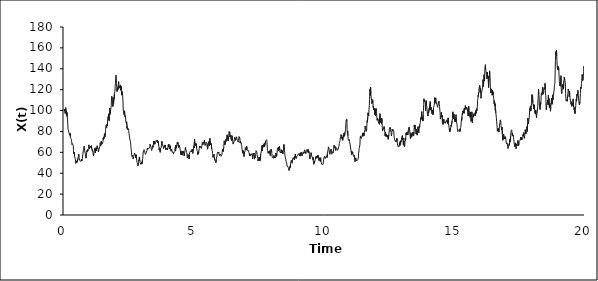
| Category | Series 0 |
|---|---|
| 0.0 | 100 |
| 0.01 | 101.451 |
| 0.02 | 100.935 |
| 0.03 | 99.133 |
| 0.04 | 97.322 |
| 0.05 | 99.582 |
| 0.06 | 102.812 |
| 0.07 | 97.484 |
| 0.08 | 99.941 |
| 0.09 | 95.324 |
| 0.1 | 94.769 |
| 0.11 | 98.044 |
| 0.12 | 93.605 |
| 0.13 | 91.877 |
| 0.14 | 86.959 |
| 0.15 | 82.516 |
| 0.16 | 81.269 |
| 0.17 | 81.424 |
| 0.18 | 79.445 |
| 0.19 | 78.421 |
| 0.2 | 78.264 |
| 0.21 | 78.665 |
| 0.22 | 76.45 |
| 0.23 | 78.109 |
| 0.24 | 74.912 |
| 0.25 | 74.454 |
| 0.26 | 73.343 |
| 0.27 | 72.908 |
| 0.28 | 72.195 |
| 0.29 | 70.321 |
| 0.3 | 67.404 |
| 0.31 | 66.803 |
| 0.32 | 68.365 |
| 0.33 | 68.56 |
| 0.34 | 67.762 |
| 0.35 | 66.431 |
| 0.36 | 61.621 |
| 0.37 | 58.789 |
| 0.38 | 57.875 |
| 0.39 | 60.299 |
| 0.4 | 56.46 |
| 0.41 | 57.028 |
| 0.42 | 56.393 |
| 0.43 | 53.548 |
| 0.44 | 53.317 |
| 0.45 | 49.472 |
| 0.46 | 48.525 |
| 0.47 | 48.72 |
| 0.48 | 49.797 |
| 0.49 | 51.939 |
| 0.5 | 50.464 |
| 0.51 | 50.947 |
| 0.52 | 50.012 |
| 0.53 | 50.361 |
| 0.54 | 54.984 |
| 0.55 | 56.422 |
| 0.56 | 58.247 |
| 0.57 | 56.465 |
| 0.58 | 53.922 |
| 0.59 | 53.454 |
| 0.6 | 52.035 |
| 0.61 | 52.263 |
| 0.62 | 52.199 |
| 0.63 | 51.727 |
| 0.64 | 51.348 |
| 0.65 | 50.667 |
| 0.66 | 51.636 |
| 0.67 | 53.599 |
| 0.68 | 51.683 |
| 0.69 | 53.148 |
| 0.7 | 54.255 |
| 0.71 | 56.475 |
| 0.72 | 58.19 |
| 0.73 | 59.071 |
| 0.74 | 62.389 |
| 0.75 | 62.453 |
| 0.76 | 64.327 |
| 0.77 | 65.738 |
| 0.78 | 63.385 |
| 0.79 | 62.608 |
| 0.8 | 60.332 |
| 0.81 | 59.084 |
| 0.82 | 57.493 |
| 0.83 | 55.543 |
| 0.84 | 54.444 |
| 0.85 | 56.63 |
| 0.86 | 57.421 |
| 0.87 | 57.441 |
| 0.88 | 61.735 |
| 0.89 | 60.618 |
| 0.9 | 62.57 |
| 0.91 | 61.144 |
| 0.92 | 61.824 |
| 0.93 | 62.497 |
| 0.94 | 63.682 |
| 0.95 | 67.142 |
| 0.96 | 65.563 |
| 0.97 | 63.39 |
| 0.98 | 63.021 |
| 0.99 | 62.961 |
| 1.0 | 64.101 |
| 1.01 | 65.732 |
| 1.02 | 64.725 |
| 1.03 | 63.854 |
| 1.04 | 64.057 |
| 1.05 | 66.403 |
| 1.06 | 63.3 |
| 1.07 | 62.745 |
| 1.08 | 61.685 |
| 1.09 | 62.677 |
| 1.1 | 60.776 |
| 1.11 | 60.891 |
| 1.12 | 57.862 |
| 1.13 | 56.495 |
| 1.14 | 58.837 |
| 1.15 | 60.035 |
| 1.16 | 61.666 |
| 1.17 | 62.194 |
| 1.18 | 63.827 |
| 1.19 | 62.336 |
| 1.2 | 59.356 |
| 1.21 | 62.633 |
| 1.22 | 64.475 |
| 1.23 | 62.412 |
| 1.24 | 61.426 |
| 1.25 | 64.162 |
| 1.26 | 65.332 |
| 1.27 | 66.295 |
| 1.28 | 66.498 |
| 1.29 | 66.126 |
| 1.3 | 63.152 |
| 1.31 | 62.245 |
| 1.32 | 60.383 |
| 1.33 | 62.31 |
| 1.34 | 62.064 |
| 1.35 | 62.882 |
| 1.36 | 63.177 |
| 1.37 | 65.195 |
| 1.38 | 67.477 |
| 1.39 | 69.127 |
| 1.4 | 66.031 |
| 1.41 | 68.474 |
| 1.42 | 67.36 |
| 1.43 | 70.635 |
| 1.44 | 68.477 |
| 1.45 | 67.583 |
| 1.46 | 68.59 |
| 1.47 | 68.131 |
| 1.48 | 68.42 |
| 1.49 | 70.366 |
| 1.5 | 73.67 |
| 1.51 | 72.034 |
| 1.52 | 74.569 |
| 1.53 | 73.319 |
| 1.54 | 75.301 |
| 1.55 | 77.765 |
| 1.56 | 77.622 |
| 1.57 | 74.952 |
| 1.58 | 78.365 |
| 1.59 | 80.963 |
| 1.6 | 83.975 |
| 1.61 | 84.336 |
| 1.62 | 86.025 |
| 1.63 | 83.426 |
| 1.64 | 86.504 |
| 1.65 | 85.995 |
| 1.66 | 85.355 |
| 1.67 | 89.982 |
| 1.68 | 89.493 |
| 1.69 | 94.159 |
| 1.7 | 91.401 |
| 1.71 | 96.834 |
| 1.72 | 93.762 |
| 1.73 | 90.224 |
| 1.74 | 94.099 |
| 1.75 | 102.38 |
| 1.76 | 102.456 |
| 1.77 | 96.445 |
| 1.78 | 99.122 |
| 1.79 | 100.974 |
| 1.8 | 103.315 |
| 1.81 | 105.257 |
| 1.82 | 111.909 |
| 1.83 | 113.558 |
| 1.84 | 113.208 |
| 1.85 | 111.108 |
| 1.86 | 108.02 |
| 1.87 | 103.811 |
| 1.88 | 107.613 |
| 1.89 | 109.384 |
| 1.9 | 106.893 |
| 1.91 | 112.179 |
| 1.92 | 110.914 |
| 1.93 | 116.15 |
| 1.94 | 115.364 |
| 1.95 | 118.043 |
| 1.96 | 123.143 |
| 1.97 | 126.343 |
| 1.98 | 127.058 |
| 1.99 | 133.756 |
| 2.0 | 132.527 |
| 2.01 | 126.044 |
| 2.02 | 121.928 |
| 2.03 | 118.244 |
| 2.04 | 118.373 |
| 2.05 | 121.777 |
| 2.06 | 119.601 |
| 2.07 | 119.529 |
| 2.08 | 124.057 |
| 2.09 | 127.627 |
| 2.1 | 126.548 |
| 2.11 | 121.366 |
| 2.12 | 123.246 |
| 2.13 | 122.931 |
| 2.14 | 121.85 |
| 2.15 | 121.499 |
| 2.16 | 124.575 |
| 2.17 | 119.477 |
| 2.18 | 119.425 |
| 2.19 | 123.182 |
| 2.2 | 119.778 |
| 2.21 | 114.72 |
| 2.22 | 118.328 |
| 2.23 | 119.092 |
| 2.24 | 115.721 |
| 2.25 | 114.009 |
| 2.26 | 108.883 |
| 2.27 | 100.636 |
| 2.28 | 100.022 |
| 2.29 | 97.554 |
| 2.3 | 96.179 |
| 2.31 | 98.093 |
| 2.32 | 99.727 |
| 2.33 | 95.149 |
| 2.34 | 93.896 |
| 2.35 | 95.221 |
| 2.36 | 94.059 |
| 2.37 | 89.782 |
| 2.38 | 88.179 |
| 2.39 | 87.855 |
| 2.4 | 89.28 |
| 2.41 | 90.222 |
| 2.42 | 82.907 |
| 2.43 | 84.418 |
| 2.44 | 83.854 |
| 2.45 | 81.54 |
| 2.46 | 82.562 |
| 2.47 | 81.995 |
| 2.48 | 81.108 |
| 2.49 | 78.311 |
| 2.5 | 76.604 |
| 2.51 | 74.66 |
| 2.52 | 74.73 |
| 2.53 | 71.79 |
| 2.54 | 70.991 |
| 2.55 | 70.102 |
| 2.56 | 66.619 |
| 2.57 | 63.626 |
| 2.58 | 62.191 |
| 2.59 | 58.351 |
| 2.6 | 56.142 |
| 2.61 | 55.658 |
| 2.62 | 56.773 |
| 2.63 | 57.236 |
| 2.64 | 55.425 |
| 2.65 | 53.703 |
| 2.66 | 53.854 |
| 2.67 | 56.014 |
| 2.68 | 56.968 |
| 2.69 | 57.441 |
| 2.7 | 59.389 |
| 2.71 | 59.734 |
| 2.72 | 58.289 |
| 2.73 | 57.903 |
| 2.74 | 56.89 |
| 2.75 | 54.564 |
| 2.76 | 57.76 |
| 2.77 | 55.769 |
| 2.78 | 56.254 |
| 2.79 | 51.869 |
| 2.8 | 50.507 |
| 2.81 | 50.355 |
| 2.82 | 48.319 |
| 2.83 | 46.989 |
| 2.84 | 47.598 |
| 2.85 | 48.814 |
| 2.86 | 50.127 |
| 2.87 | 52.764 |
| 2.88 | 51.748 |
| 2.89 | 55.562 |
| 2.9 | 54.276 |
| 2.91 | 53.59 |
| 2.92 | 49.791 |
| 2.93 | 49.325 |
| 2.94 | 49.516 |
| 2.95 | 48.377 |
| 2.96 | 49.18 |
| 2.97 | 48.83 |
| 2.98 | 50.702 |
| 2.99 | 49.147 |
| 3.0 | 49.968 |
| 3.01 | 53.089 |
| 3.02 | 54.234 |
| 3.03 | 58.381 |
| 3.04 | 58.597 |
| 3.05 | 61.628 |
| 3.06 | 62.386 |
| 3.07 | 62.598 |
| 3.08 | 61.817 |
| 3.09 | 61.621 |
| 3.1 | 61.221 |
| 3.11 | 60.943 |
| 3.12 | 58.039 |
| 3.13 | 57.825 |
| 3.14 | 57.858 |
| 3.15 | 57.528 |
| 3.16 | 59.799 |
| 3.17 | 60.305 |
| 3.18 | 61.927 |
| 3.19 | 61.994 |
| 3.2 | 64.098 |
| 3.21 | 62.814 |
| 3.22 | 63.068 |
| 3.23 | 62.582 |
| 3.24 | 63.942 |
| 3.25 | 63.853 |
| 3.26 | 64.202 |
| 3.27 | 63.746 |
| 3.28 | 64.237 |
| 3.29 | 65.532 |
| 3.3 | 67.724 |
| 3.31 | 68.231 |
| 3.32 | 66.95 |
| 3.33 | 65.668 |
| 3.34 | 65.569 |
| 3.35 | 62.905 |
| 3.36 | 61.761 |
| 3.37 | 62.226 |
| 3.38 | 62.884 |
| 3.39 | 64.867 |
| 3.4 | 66.386 |
| 3.41 | 64.768 |
| 3.42 | 65.919 |
| 3.43 | 68.011 |
| 3.44 | 70.444 |
| 3.45 | 67.608 |
| 3.46 | 70.818 |
| 3.47 | 69.681 |
| 3.48 | 69.127 |
| 3.49 | 67.831 |
| 3.5 | 68.104 |
| 3.51 | 69.182 |
| 3.52 | 68.684 |
| 3.53 | 68.956 |
| 3.54 | 71.369 |
| 3.55 | 70.323 |
| 3.56 | 69.723 |
| 3.57 | 71.865 |
| 3.58 | 71.293 |
| 3.59 | 71.352 |
| 3.6 | 69.249 |
| 3.61 | 70.521 |
| 3.62 | 70.93 |
| 3.63 | 67.145 |
| 3.64 | 65.191 |
| 3.65 | 62.247 |
| 3.66 | 62.474 |
| 3.67 | 64.297 |
| 3.68 | 61.605 |
| 3.69 | 60.015 |
| 3.7 | 63.441 |
| 3.71 | 63.339 |
| 3.72 | 62.692 |
| 3.73 | 64.847 |
| 3.74 | 67.101 |
| 3.75 | 70.59 |
| 3.76 | 70.291 |
| 3.77 | 68.631 |
| 3.78 | 68.26 |
| 3.79 | 68.859 |
| 3.8 | 65.831 |
| 3.81 | 64.714 |
| 3.82 | 63.718 |
| 3.83 | 64.235 |
| 3.84 | 64.313 |
| 3.85 | 66.406 |
| 3.86 | 66.303 |
| 3.87 | 65.336 |
| 3.88 | 67.069 |
| 3.89 | 64.328 |
| 3.9 | 62.445 |
| 3.91 | 62.951 |
| 3.92 | 63.86 |
| 3.93 | 62.864 |
| 3.94 | 63.518 |
| 3.95 | 63.527 |
| 3.96 | 64.245 |
| 3.97 | 62.365 |
| 3.98 | 63.704 |
| 3.99 | 64.775 |
| 4.0 | 67.165 |
| 4.01 | 65.502 |
| 4.02 | 67.802 |
| 4.03 | 66.03 |
| 4.04 | 65.014 |
| 4.05 | 63.138 |
| 4.06 | 63.798 |
| 4.07 | 66.35 |
| 4.08 | 66.306 |
| 4.09 | 63.589 |
| 4.1 | 61.157 |
| 4.11 | 60.554 |
| 4.12 | 61.595 |
| 4.13 | 62.83 |
| 4.14 | 63.016 |
| 4.15 | 60.086 |
| 4.16 | 59.569 |
| 4.17 | 60.171 |
| 4.18 | 60.567 |
| 4.19 | 60.162 |
| 4.2 | 58.366 |
| 4.21 | 59.588 |
| 4.22 | 60.078 |
| 4.23 | 58.989 |
| 4.24 | 60.063 |
| 4.25 | 60.902 |
| 4.26 | 60.377 |
| 4.27 | 64.969 |
| 4.28 | 61.248 |
| 4.29 | 66.908 |
| 4.3 | 66.733 |
| 4.31 | 63.997 |
| 4.32 | 65.521 |
| 4.33 | 67.588 |
| 4.34 | 67.671 |
| 4.35 | 69.925 |
| 4.36 | 68.023 |
| 4.37 | 69.356 |
| 4.38 | 66.462 |
| 4.39 | 65.889 |
| 4.4 | 64.633 |
| 4.41 | 66.878 |
| 4.42 | 67.459 |
| 4.43 | 66.837 |
| 4.44 | 64.886 |
| 4.45 | 65.826 |
| 4.46 | 61.802 |
| 4.47 | 60.531 |
| 4.48 | 57.862 |
| 4.49 | 61.352 |
| 4.5 | 61.8 |
| 4.51 | 61.389 |
| 4.52 | 60.502 |
| 4.53 | 57.351 |
| 4.54 | 60.126 |
| 4.55 | 59.149 |
| 4.56 | 59.049 |
| 4.57 | 61.315 |
| 4.58 | 60.481 |
| 4.59 | 59.176 |
| 4.6 | 57.789 |
| 4.61 | 56.58 |
| 4.62 | 58.402 |
| 4.63 | 57.94 |
| 4.64 | 61.693 |
| 4.65 | 61.543 |
| 4.66 | 64.691 |
| 4.67 | 63.001 |
| 4.68 | 63.851 |
| 4.69 | 63.714 |
| 4.7 | 63.544 |
| 4.71 | 59.676 |
| 4.72 | 57.111 |
| 4.73 | 54.742 |
| 4.74 | 55.07 |
| 4.75 | 56.649 |
| 4.76 | 57.864 |
| 4.769999999999999 | 56.712 |
| 4.78 | 57.381 |
| 4.79 | 55.359 |
| 4.8 | 53.641 |
| 4.81 | 57.745 |
| 4.82 | 59.407 |
| 4.83 | 59.4 |
| 4.84 | 59.675 |
| 4.85 | 61.223 |
| 4.86 | 60.344 |
| 4.87 | 61.472 |
| 4.88 | 61.195 |
| 4.89 | 61.639 |
| 4.9 | 60.331 |
| 4.91 | 62.016 |
| 4.92 | 63.046 |
| 4.93 | 60.993 |
| 4.94 | 58.936 |
| 4.95 | 59.896 |
| 4.96 | 59.407 |
| 4.97 | 62.361 |
| 4.98 | 65.822 |
| 4.99 | 64.243 |
| 5.0 | 65.145 |
| 5.01 | 72.613 |
| 5.02 | 66.92 |
| 5.03 | 68.937 |
| 5.04 | 68.297 |
| 5.05 | 66.424 |
| 5.06 | 66.472 |
| 5.07 | 65.783 |
| 5.08 | 68.227 |
| 5.09 | 64.102 |
| 5.1 | 62.283 |
| 5.11 | 61.418 |
| 5.12 | 60.859 |
| 5.13 | 57.848 |
| 5.14 | 57.269 |
| 5.15 | 60.192 |
| 5.16 | 58.386 |
| 5.17 | 60.835 |
| 5.18 | 61.439 |
| 5.19 | 63.477 |
| 5.2 | 66.072 |
| 5.21 | 64.568 |
| 5.22 | 64.712 |
| 5.23 | 64.049 |
| 5.24 | 65.632 |
| 5.25 | 65.064 |
| 5.26 | 64.726 |
| 5.27 | 63.649 |
| 5.28 | 62.758 |
| 5.29 | 66.119 |
| 5.3 | 66.696 |
| 5.31 | 69.35 |
| 5.32 | 68.469 |
| 5.33 | 67.382 |
| 5.34 | 68.869 |
| 5.35 | 68.327 |
| 5.36 | 69.726 |
| 5.37 | 69.127 |
| 5.38 | 70.517 |
| 5.39 | 71.788 |
| 5.4 | 68.192 |
| 5.41 | 66.502 |
| 5.42 | 67.328 |
| 5.43 | 66.786 |
| 5.44 | 67.949 |
| 5.45 | 68.115 |
| 5.46 | 69.846 |
| 5.47 | 69.561 |
| 5.48 | 68.384 |
| 5.49 | 65.823 |
| 5.5 | 65.498 |
| 5.51 | 62.999 |
| 5.52 | 63.213 |
| 5.53 | 68.316 |
| 5.54 | 68.771 |
| 5.55 | 70.164 |
| 5.56 | 69.358 |
| 5.57 | 69.538 |
| 5.58 | 66.309 |
| 5.59 | 71.801 |
| 5.6 | 73.312 |
| 5.61 | 71.405 |
| 5.62 | 71.035 |
| 5.63 | 67.101 |
| 5.64 | 67.383 |
| 5.65 | 68.365 |
| 5.66 | 68.082 |
| 5.67 | 63.312 |
| 5.68 | 63.649 |
| 5.69 | 61.805 |
| 5.7 | 58.98 |
| 5.71 | 58.874 |
| 5.72 | 55.181 |
| 5.73 | 56.79 |
| 5.74 | 56.347 |
| 5.75 | 57.127 |
| 5.76 | 58.416 |
| 5.769999999999999 | 56.06 |
| 5.78 | 52.37 |
| 5.79 | 52.476 |
| 5.8 | 51.939 |
| 5.81 | 52.07 |
| 5.82 | 52.347 |
| 5.83 | 50.166 |
| 5.84 | 53.51 |
| 5.85 | 54.574 |
| 5.86 | 53.975 |
| 5.87 | 56.529 |
| 5.88 | 58.455 |
| 5.89 | 57.858 |
| 5.9 | 60.224 |
| 5.91 | 59.489 |
| 5.92 | 59.243 |
| 5.93 | 59.643 |
| 5.94 | 60.399 |
| 5.95 | 58.333 |
| 5.96 | 57.735 |
| 5.97 | 56.922 |
| 5.98 | 57.893 |
| 5.99 | 57.029 |
| 6.0 | 57.033 |
| 6.01 | 57.066 |
| 6.02 | 57.847 |
| 6.03 | 56.266 |
| 6.04 | 56.836 |
| 6.05 | 56.775 |
| 6.06 | 58.114 |
| 6.07 | 59.8 |
| 6.08 | 62.986 |
| 6.09 | 62.882 |
| 6.1 | 63.313 |
| 6.11 | 60.754 |
| 6.12 | 60.136 |
| 6.13 | 64.533 |
| 6.14 | 68.597 |
| 6.15 | 70.969 |
| 6.16 | 68.696 |
| 6.17 | 67.782 |
| 6.18 | 67.184 |
| 6.19 | 67.975 |
| 6.2 | 71.307 |
| 6.21 | 72.392 |
| 6.22 | 70.549 |
| 6.23 | 72.21 |
| 6.24 | 71.924 |
| 6.25 | 72.714 |
| 6.26 | 76.812 |
| 6.27 | 76.412 |
| 6.28 | 76.779 |
| 6.29 | 76.002 |
| 6.3 | 71.154 |
| 6.31 | 74.245 |
| 6.32 | 76.095 |
| 6.33 | 78.002 |
| 6.34 | 79.937 |
| 6.35 | 78.147 |
| 6.36 | 79.153 |
| 6.37 | 74.796 |
| 6.38 | 74.975 |
| 6.39 | 75.601 |
| 6.4 | 76.542 |
| 6.41 | 73.028 |
| 6.42 | 73.645 |
| 6.43 | 71.213 |
| 6.44 | 74.227 |
| 6.45 | 75.904 |
| 6.46 | 73.788 |
| 6.47 | 71.814 |
| 6.48 | 69.508 |
| 6.49 | 67.9 |
| 6.5 | 68.471 |
| 6.51 | 67.915 |
| 6.52 | 70.039 |
| 6.53 | 70.776 |
| 6.54 | 72.498 |
| 6.55 | 74.347 |
| 6.56 | 74.35 |
| 6.57 | 74.083 |
| 6.58 | 71.454 |
| 6.59 | 71.425 |
| 6.6 | 72.552 |
| 6.61 | 72.253 |
| 6.62 | 74.792 |
| 6.63 | 72.818 |
| 6.64 | 72.141 |
| 6.65 | 72.225 |
| 6.66 | 71.352 |
| 6.67 | 71.403 |
| 6.68 | 70.692 |
| 6.69 | 69.764 |
| 6.7 | 71.529 |
| 6.71 | 70.764 |
| 6.72 | 74.972 |
| 6.73 | 74.642 |
| 6.74 | 75.027 |
| 6.75 | 73.058 |
| 6.76 | 69.011 |
| 6.769999999999999 | 70.641 |
| 6.78 | 70.392 |
| 6.79 | 70.319 |
| 6.8 | 68.317 |
| 6.81 | 67.709 |
| 6.82 | 66.373 |
| 6.83 | 63.883 |
| 6.84 | 61.825 |
| 6.85 | 59.77 |
| 6.86 | 62.084 |
| 6.87 | 60.33 |
| 6.88 | 58.823 |
| 6.89 | 60.747 |
| 6.9 | 59.141 |
| 6.91 | 55.928 |
| 6.92 | 59.113 |
| 6.93 | 59.535 |
| 6.94 | 59.902 |
| 6.95 | 61.562 |
| 6.96 | 64.52 |
| 6.97 | 65.209 |
| 6.98 | 63.047 |
| 6.99 | 62.01 |
| 7.0 | 62.347 |
| 7.01 | 65.761 |
| 7.02 | 65.479 |
| 7.03 | 62.792 |
| 7.04 | 62.418 |
| 7.05 | 61.662 |
| 7.06 | 61.623 |
| 7.07 | 60.846 |
| 7.08 | 62.561 |
| 7.09 | 61.619 |
| 7.1 | 59.974 |
| 7.11 | 59.85 |
| 7.12 | 57.167 |
| 7.13 | 58.538 |
| 7.14 | 56.6 |
| 7.15 | 58.05 |
| 7.16 | 57.524 |
| 7.17 | 57.392 |
| 7.18 | 58.816 |
| 7.19 | 57.703 |
| 7.2 | 57.084 |
| 7.21 | 58.861 |
| 7.22 | 57.647 |
| 7.23 | 56.397 |
| 7.24 | 53.828 |
| 7.25 | 57.205 |
| 7.26 | 58.716 |
| 7.27 | 57.554 |
| 7.28 | 56.78 |
| 7.29 | 59.227 |
| 7.3 | 56.207 |
| 7.31 | 53.478 |
| 7.32 | 55.857 |
| 7.33 | 55.319 |
| 7.34 | 54.729 |
| 7.35 | 55.83 |
| 7.36 | 58.604 |
| 7.37 | 61.681 |
| 7.38 | 61.218 |
| 7.39 | 61.725 |
| 7.4 | 60.499 |
| 7.41 | 57.871 |
| 7.42 | 56.963 |
| 7.43 | 55.554 |
| 7.44 | 53.842 |
| 7.45 | 51.727 |
| 7.46 | 52.792 |
| 7.47 | 52.397 |
| 7.48 | 55.18 |
| 7.49 | 52.704 |
| 7.5 | 53.745 |
| 7.51 | 55.216 |
| 7.52 | 51.919 |
| 7.53 | 55.049 |
| 7.54 | 53.66 |
| 7.55 | 58.263 |
| 7.56 | 58.849 |
| 7.57 | 58.047 |
| 7.58 | 58.861 |
| 7.59 | 63.474 |
| 7.6 | 66.57 |
| 7.61 | 61.357 |
| 7.62 | 66.868 |
| 7.63 | 66.586 |
| 7.64 | 67.224 |
| 7.65 | 65.06 |
| 7.66 | 67.464 |
| 7.67 | 65.014 |
| 7.68 | 66.646 |
| 7.69 | 68.659 |
| 7.7 | 65.703 |
| 7.71 | 65.328 |
| 7.72 | 66.654 |
| 7.73 | 69.765 |
| 7.74 | 71.143 |
| 7.75 | 71.432 |
| 7.76 | 70.639 |
| 7.769999999999999 | 70.754 |
| 7.78 | 71.935 |
| 7.79 | 70.099 |
| 7.8 | 70.514 |
| 7.81 | 61.607 |
| 7.82 | 61.862 |
| 7.83 | 62.279 |
| 7.84 | 59.013 |
| 7.85 | 60.763 |
| 7.86 | 61.167 |
| 7.87 | 59.812 |
| 7.88 | 60.327 |
| 7.89 | 60.698 |
| 7.9 | 59.104 |
| 7.91 | 61.708 |
| 7.92 | 56.947 |
| 7.93 | 59.803 |
| 7.94 | 61.019 |
| 7.95 | 63.107 |
| 7.96 | 63.369 |
| 7.97 | 61.375 |
| 7.98 | 58.816 |
| 7.99 | 55.298 |
| 8.0 | 55.963 |
| 8.01 | 54.625 |
| 8.02 | 54.582 |
| 8.03 | 54.242 |
| 8.04 | 55.237 |
| 8.05 | 55.11 |
| 8.06 | 57.032 |
| 8.07 | 54.687 |
| 8.08 | 55.986 |
| 8.09 | 56.781 |
| 8.1 | 55.132 |
| 8.11 | 54.64 |
| 8.12 | 55.786 |
| 8.13 | 59.398 |
| 8.14 | 58.61 |
| 8.15 | 58.189 |
| 8.16 | 56.097 |
| 8.17 | 58.38 |
| 8.18 | 60.189 |
| 8.19 | 63.461 |
| 8.2 | 62.975 |
| 8.21 | 62.659 |
| 8.22 | 64.608 |
| 8.23 | 61.664 |
| 8.24 | 62.173 |
| 8.25 | 65.071 |
| 8.26 | 62.965 |
| 8.27 | 65.976 |
| 8.28 | 62.601 |
| 8.29 | 60.034 |
| 8.3 | 59.586 |
| 8.31 | 59.152 |
| 8.32 | 60.636 |
| 8.33 | 59.535 |
| 8.34 | 62.528 |
| 8.35 | 59.616 |
| 8.36 | 59.725 |
| 8.37 | 58.945 |
| 8.38 | 61.652 |
| 8.39 | 60.84 |
| 8.4 | 58.627 |
| 8.41 | 59.645 |
| 8.42 | 62.082 |
| 8.43 | 63.1 |
| 8.44 | 67.57 |
| 8.45 | 66.615 |
| 8.46 | 61.771 |
| 8.47 | 59.843 |
| 8.48 | 57.011 |
| 8.49 | 57.377 |
| 8.5 | 54.445 |
| 8.51 | 53.13 |
| 8.52 | 53.465 |
| 8.53 | 50.605 |
| 8.54 | 50.315 |
| 8.55 | 49.635 |
| 8.56 | 46.876 |
| 8.57 | 46.647 |
| 8.58 | 46.301 |
| 8.59 | 46.978 |
| 8.6 | 46.199 |
| 8.61 | 45.193 |
| 8.62 | 44.035 |
| 8.63 | 43.145 |
| 8.64 | 42.435 |
| 8.65 | 42.536 |
| 8.66 | 43.882 |
| 8.67 | 46.411 |
| 8.68 | 45.332 |
| 8.69 | 46.138 |
| 8.7 | 48.584 |
| 8.71 | 51.324 |
| 8.72 | 51.254 |
| 8.73 | 52.518 |
| 8.74 | 50.586 |
| 8.75 | 51.113 |
| 8.76 | 49.554 |
| 8.77 | 52.619 |
| 8.78 | 53.929 |
| 8.79 | 53.653 |
| 8.8 | 55.074 |
| 8.81 | 54.746 |
| 8.82 | 55.39 |
| 8.83 | 55.955 |
| 8.84 | 52.903 |
| 8.85 | 55.883 |
| 8.86 | 55.379 |
| 8.87 | 54.595 |
| 8.88 | 58.214 |
| 8.89 | 56.725 |
| 8.9 | 56.549 |
| 8.91 | 54.077 |
| 8.92 | 54.408 |
| 8.93 | 55.735 |
| 8.94 | 54.973 |
| 8.95 | 55.417 |
| 8.96 | 56.092 |
| 8.97 | 56.88 |
| 8.98 | 57.656 |
| 8.99 | 58.638 |
| 9.0 | 59.26 |
| 9.01 | 58.815 |
| 9.02 | 59.2 |
| 9.03 | 57.736 |
| 9.04 | 57.877 |
| 9.05 | 56.604 |
| 9.06 | 59.116 |
| 9.07 | 57.614 |
| 9.08 | 56.373 |
| 9.09 | 57.875 |
| 9.1 | 60.199 |
| 9.11 | 58.82 |
| 9.12 | 59.176 |
| 9.13 | 57.943 |
| 9.14 | 56.836 |
| 9.15 | 58.487 |
| 9.16 | 58.67 |
| 9.17 | 58.615 |
| 9.18 | 60.015 |
| 9.19 | 59.009 |
| 9.2 | 60.343 |
| 9.21 | 59.254 |
| 9.22 | 60.661 |
| 9.23 | 61.376 |
| 9.24 | 62.399 |
| 9.25 | 62.294 |
| 9.26 | 60.428 |
| 9.27 | 60.556 |
| 9.28 | 58.767 |
| 9.29 | 60.163 |
| 9.3 | 60.818 |
| 9.31 | 61.29 |
| 9.32 | 60.674 |
| 9.33 | 62.658 |
| 9.34 | 62.981 |
| 9.35 | 62.483 |
| 9.36 | 60.273 |
| 9.37 | 62.811 |
| 9.38 | 59.642 |
| 9.39 | 61.557 |
| 9.4 | 61.187 |
| 9.41 | 59.517 |
| 9.42 | 57.653 |
| 9.43 | 54.751 |
| 9.44 | 53.774 |
| 9.45 | 55.212 |
| 9.46 | 54.822 |
| 9.47 | 56.346 |
| 9.48 | 59.672 |
| 9.49 | 58.82 |
| 9.5 | 57.615 |
| 9.51 | 56.269 |
| 9.52 | 55.772 |
| 9.53 | 56.463 |
| 9.54 | 54.688 |
| 9.55 | 53.082 |
| 9.56 | 54.991 |
| 9.57 | 52.2 |
| 9.58 | 50.5 |
| 9.59 | 48.64 |
| 9.6 | 48.116 |
| 9.61 | 47.962 |
| 9.62 | 48.199 |
| 9.63 | 51.998 |
| 9.64 | 51.196 |
| 9.65 | 53.391 |
| 9.66 | 53.722 |
| 9.67 | 55.68 |
| 9.68 | 54.69 |
| 9.69 | 56.502 |
| 9.7 | 54.372 |
| 9.71 | 53.958 |
| 9.72 | 54.77 |
| 9.73 | 56.501 |
| 9.74 | 54.942 |
| 9.75 | 57.17 |
| 9.76 | 56.375 |
| 9.77 | 53.984 |
| 9.78 | 54.579 |
| 9.79 | 52.093 |
| 9.8 | 52.48 |
| 9.81 | 54.788 |
| 9.82 | 54.365 |
| 9.83 | 53.477 |
| 9.84 | 51.195 |
| 9.85 | 54.77 |
| 9.86 | 51.577 |
| 9.87 | 52.227 |
| 9.88 | 49.982 |
| 9.89 | 50.516 |
| 9.9 | 48.428 |
| 9.91 | 48.937 |
| 9.92 | 49.279 |
| 9.93 | 47.5 |
| 9.94 | 48.31 |
| 9.95 | 48.761 |
| 9.96 | 50.84 |
| 9.97 | 53.791 |
| 9.98 | 53.387 |
| 9.99 | 54.509 |
| 10.0 | 56.424 |
| 10.01 | 55.276 |
| 10.02 | 55.774 |
| 10.03 | 54.034 |
| 10.04 | 54.882 |
| 10.05 | 54.677 |
| 10.06 | 54.874 |
| 10.07 | 55.893 |
| 10.08 | 55.277 |
| 10.09 | 56.919 |
| 10.1 | 55.021 |
| 10.11 | 58.562 |
| 10.12 | 59.055 |
| 10.13 | 61.712 |
| 10.14 | 62.983 |
| 10.15 | 65.192 |
| 10.16 | 64.399 |
| 10.17 | 63.473 |
| 10.18 | 61.278 |
| 10.19 | 59.471 |
| 10.2 | 59.76 |
| 10.21 | 58.127 |
| 10.22 | 59.338 |
| 10.23 | 61.034 |
| 10.24 | 61.319 |
| 10.25 | 63.116 |
| 10.26 | 60.229 |
| 10.27 | 59.856 |
| 10.28 | 58.224 |
| 10.29 | 58.784 |
| 10.3 | 59.635 |
| 10.31 | 59.106 |
| 10.32 | 60.63 |
| 10.33 | 59.617 |
| 10.34 | 61.098 |
| 10.35 | 63.391 |
| 10.36 | 65.121 |
| 10.37 | 66.858 |
| 10.38 | 65.299 |
| 10.39 | 64.261 |
| 10.4 | 65.769 |
| 10.41 | 63.94 |
| 10.42 | 62.977 |
| 10.43 | 61.788 |
| 10.44 | 64.424 |
| 10.45 | 64.606 |
| 10.46 | 63.76 |
| 10.47 | 64.009 |
| 10.48 | 63.562 |
| 10.49 | 63.339 |
| 10.5 | 61.913 |
| 10.51 | 61.129 |
| 10.52 | 61.506 |
| 10.53 | 62.341 |
| 10.54 | 64.172 |
| 10.55 | 65.598 |
| 10.56 | 66.821 |
| 10.57 | 68.563 |
| 10.58 | 69.62 |
| 10.59 | 70.58 |
| 10.6 | 71.189 |
| 10.61 | 70.419 |
| 10.62 | 75.128 |
| 10.63 | 75.891 |
| 10.64 | 76.995 |
| 10.65 | 75.195 |
| 10.66 | 73.448 |
| 10.67 | 74.464 |
| 10.68 | 72.889 |
| 10.69 | 72.55 |
| 10.7 | 71.459 |
| 10.71 | 72.149 |
| 10.72 | 76.081 |
| 10.73 | 75.727 |
| 10.74 | 74.609 |
| 10.75 | 78.394 |
| 10.76 | 78.009 |
| 10.77 | 75.781 |
| 10.78 | 76.066 |
| 10.79 | 79.259 |
| 10.8 | 79.651 |
| 10.81 | 81.887 |
| 10.82 | 87.365 |
| 10.83 | 89.979 |
| 10.84 | 90.529 |
| 10.85 | 91.935 |
| 10.86 | 89.613 |
| 10.87 | 80.599 |
| 10.88 | 78.842 |
| 10.89 | 80.501 |
| 10.9 | 75.786 |
| 10.91 | 72.45 |
| 10.92 | 71.634 |
| 10.93 | 71.251 |
| 10.94 | 72.142 |
| 10.95 | 72.377 |
| 10.96 | 70.156 |
| 10.97 | 70.073 |
| 10.98 | 68.078 |
| 10.99 | 68.109 |
| 11.0 | 67.157 |
| 11.01 | 63.081 |
| 11.02 | 61.039 |
| 11.03 | 59.597 |
| 11.04 | 57.841 |
| 11.05 | 60.958 |
| 11.06 | 61.037 |
| 11.07 | 59.047 |
| 11.08 | 60.214 |
| 11.09 | 58.915 |
| 11.1 | 57.229 |
| 11.11 | 56.566 |
| 11.12 | 57.648 |
| 11.13 | 55.942 |
| 11.14 | 57.303 |
| 11.15 | 55.829 |
| 11.16 | 52.454 |
| 11.17 | 51.042 |
| 11.18 | 52.246 |
| 11.19 | 53.275 |
| 11.2 | 54.689 |
| 11.21 | 52.487 |
| 11.22 | 53.101 |
| 11.23 | 52.366 |
| 11.24 | 52.089 |
| 11.25 | 51.927 |
| 11.26 | 51.287 |
| 11.27 | 52.393 |
| 11.28 | 53.005 |
| 11.29 | 52.82 |
| 11.3 | 54.47 |
| 11.31 | 59.309 |
| 11.32 | 60.353 |
| 11.33 | 63.39 |
| 11.34 | 62.983 |
| 11.35 | 63.901 |
| 11.36 | 67.135 |
| 11.37 | 73.121 |
| 11.38 | 75.697 |
| 11.39 | 75.448 |
| 11.4 | 76.529 |
| 11.41 | 73.398 |
| 11.42 | 73.588 |
| 11.43 | 73.936 |
| 11.44 | 75.217 |
| 11.45 | 75.898 |
| 11.46 | 78.574 |
| 11.47 | 77.314 |
| 11.48 | 75.351 |
| 11.49 | 77.45 |
| 11.5 | 78.697 |
| 11.51 | 75.738 |
| 11.52 | 75.59 |
| 11.53 | 77.429 |
| 11.54 | 79.079 |
| 11.55 | 81.776 |
| 11.56 | 85.14 |
| 11.57 | 84.489 |
| 11.58 | 83.486 |
| 11.59 | 81.277 |
| 11.6 | 80.111 |
| 11.61 | 79.677 |
| 11.62 | 82.158 |
| 11.63 | 88.024 |
| 11.64 | 90.468 |
| 11.65 | 88.798 |
| 11.66 | 94.036 |
| 11.67 | 97.814 |
| 11.68 | 98.652 |
| 11.69 | 94.707 |
| 11.7 | 95.802 |
| 11.71 | 101.436 |
| 11.72 | 104.783 |
| 11.73 | 110.317 |
| 11.74 | 116.525 |
| 11.75 | 120.776 |
| 11.76 | 114.432 |
| 11.77 | 122.439 |
| 11.78 | 115.373 |
| 11.79 | 116.026 |
| 11.8 | 115.057 |
| 11.81 | 109.431 |
| 11.82 | 106.657 |
| 11.83 | 107.834 |
| 11.84 | 108.673 |
| 11.85 | 110.458 |
| 11.86 | 107.491 |
| 11.87 | 102.953 |
| 11.88 | 104.327 |
| 11.89 | 100.572 |
| 11.9 | 100.894 |
| 11.91 | 102.354 |
| 11.92 | 99.966 |
| 11.93 | 96.142 |
| 11.94 | 96.584 |
| 11.95 | 101.045 |
| 11.96 | 95.032 |
| 11.97 | 100.374 |
| 11.98 | 102.023 |
| 11.99 | 99.402 |
| 12.0 | 98.101 |
| 12.01 | 93.857 |
| 12.02 | 90.776 |
| 12.03 | 91.442 |
| 12.04 | 92.304 |
| 12.05 | 92.69 |
| 12.06 | 90.098 |
| 12.07 | 89.872 |
| 12.08 | 87.962 |
| 12.09 | 90.265 |
| 12.1 | 91.778 |
| 12.11 | 86.858 |
| 12.12 | 93.901 |
| 12.13 | 96.996 |
| 12.14 | 93.926 |
| 12.15 | 88.597 |
| 12.16 | 89.167 |
| 12.17 | 87.884 |
| 12.18 | 92.752 |
| 12.19 | 87.071 |
| 12.2 | 92.37 |
| 12.21 | 89.078 |
| 12.22 | 83.509 |
| 12.23 | 80.599 |
| 12.24 | 80.337 |
| 12.25 | 80.496 |
| 12.26 | 81.726 |
| 12.27 | 81.777 |
| 12.28 | 82.371 |
| 12.29 | 84.716 |
| 12.3 | 82.104 |
| 12.31 | 81.399 |
| 12.32 | 79.008 |
| 12.33 | 75.569 |
| 12.34 | 79.523 |
| 12.35 | 78.004 |
| 12.36 | 78.926 |
| 12.37 | 74.87 |
| 12.38 | 77.234 |
| 12.39 | 76.508 |
| 12.4 | 76.643 |
| 12.41 | 75.335 |
| 12.42 | 74.726 |
| 12.43 | 74.253 |
| 12.44 | 76.562 |
| 12.45 | 72.52 |
| 12.46 | 72.876 |
| 12.47 | 76.405 |
| 12.48 | 75.625 |
| 12.49 | 81.74 |
| 12.5 | 82.437 |
| 12.51 | 80.868 |
| 12.52 | 83.974 |
| 12.53 | 82.141 |
| 12.54 | 80.327 |
| 12.55 | 79.8 |
| 12.56 | 78.952 |
| 12.57 | 75.628 |
| 12.58 | 77.163 |
| 12.59 | 79.325 |
| 12.6 | 82.007 |
| 12.61 | 80.673 |
| 12.62 | 80.881 |
| 12.63 | 81.789 |
| 12.64 | 81.57 |
| 12.65 | 81.099 |
| 12.66 | 80.428 |
| 12.67 | 75.833 |
| 12.68 | 73.924 |
| 12.69 | 73.253 |
| 12.7 | 71.532 |
| 12.71 | 72.429 |
| 12.72 | 71.128 |
| 12.73 | 69.994 |
| 12.74 | 70.937 |
| 12.75 | 71.497 |
| 12.76 | 70.392 |
| 12.77 | 71.226 |
| 12.78 | 73.338 |
| 12.79 | 70.804 |
| 12.8 | 70.086 |
| 12.81 | 66.657 |
| 12.82 | 65.623 |
| 12.83 | 65.498 |
| 12.84 | 65.654 |
| 12.85 | 65.343 |
| 12.86 | 65.172 |
| 12.87 | 67.435 |
| 12.88 | 68.904 |
| 12.89 | 66.184 |
| 12.9 | 70.096 |
| 12.91 | 69.55 |
| 12.92 | 67.595 |
| 12.93 | 71.068 |
| 12.94 | 69.869 |
| 12.95 | 71.017 |
| 12.96 | 74.072 |
| 12.97 | 73.282 |
| 12.98 | 73.561 |
| 12.99 | 76.004 |
| 13.0 | 75.076 |
| 13.01 | 72.3 |
| 13.02 | 73.672 |
| 13.03 | 66.892 |
| 13.04 | 66.609 |
| 13.05 | 70.564 |
| 13.06 | 68.986 |
| 13.07 | 65.17 |
| 13.08 | 66.237 |
| 13.09 | 69.209 |
| 13.1 | 73.57 |
| 13.11 | 71.448 |
| 13.12 | 73.21 |
| 13.13 | 78.289 |
| 13.14 | 76.567 |
| 13.15 | 78.762 |
| 13.16 | 79.195 |
| 13.17 | 76.97 |
| 13.18 | 79.35 |
| 13.19 | 78.054 |
| 13.2 | 76.753 |
| 13.21 | 76.492 |
| 13.22 | 81.09 |
| 13.23 | 82.277 |
| 13.24 | 81.868 |
| 13.25 | 84.05 |
| 13.26 | 83.578 |
| 13.27 | 80.685 |
| 13.28 | 77.695 |
| 13.29 | 75.535 |
| 13.3 | 73.21 |
| 13.31 | 76.588 |
| 13.32 | 78.709 |
| 13.33 | 74.48 |
| 13.34 | 76.689 |
| 13.35 | 75.101 |
| 13.36 | 75.205 |
| 13.37 | 75.659 |
| 13.38 | 74.86 |
| 13.39 | 78.986 |
| 13.4 | 76.891 |
| 13.41 | 76.729 |
| 13.42 | 75.595 |
| 13.43 | 76.46 |
| 13.44 | 79.855 |
| 13.45 | 86.237 |
| 13.46 | 82.283 |
| 13.47 | 86.122 |
| 13.48 | 86.659 |
| 13.49 | 84.121 |
| 13.5 | 80.257 |
| 13.51 | 80.132 |
| 13.52 | 77.498 |
| 13.53 | 80.111 |
| 13.54 | 81.976 |
| 13.55 | 77.987 |
| 13.56 | 76.447 |
| 13.57 | 79.189 |
| 13.58 | 80.668 |
| 13.59 | 84.538 |
| 13.6 | 84.938 |
| 13.61 | 80.104 |
| 13.62 | 78.638 |
| 13.63 | 79.801 |
| 13.64 | 84.661 |
| 13.65 | 83.432 |
| 13.66 | 86.48 |
| 13.67 | 86.933 |
| 13.68 | 88.375 |
| 13.69 | 91.863 |
| 13.7 | 93.306 |
| 13.71 | 92.655 |
| 13.72 | 91.673 |
| 13.73 | 98.882 |
| 13.74 | 94.806 |
| 13.75 | 94.142 |
| 13.76 | 91.423 |
| 13.77 | 93.734 |
| 13.78 | 89.917 |
| 13.79 | 95.685 |
| 13.8 | 99.858 |
| 13.81 | 105.912 |
| 13.82 | 111.304 |
| 13.83 | 108.333 |
| 13.84 | 109.192 |
| 13.85 | 109.531 |
| 13.86 | 110.329 |
| 13.87 | 108.533 |
| 13.88 | 99.966 |
| 13.89 | 106.012 |
| 13.9 | 105.846 |
| 13.91 | 109.48 |
| 13.92 | 104.819 |
| 13.93 | 103.663 |
| 13.94 | 99.162 |
| 13.95 | 98.808 |
| 13.96 | 98.357 |
| 13.97 | 94.737 |
| 13.98 | 94.241 |
| 13.99 | 99.92 |
| 14.0 | 98.063 |
| 14.01 | 97.438 |
| 14.02 | 102.005 |
| 14.03 | 100.594 |
| 14.04 | 101.431 |
| 14.05 | 105.935 |
| 14.06 | 108.599 |
| 14.07 | 103.726 |
| 14.08 | 100.389 |
| 14.09 | 103.047 |
| 14.1 | 100.998 |
| 14.11 | 100.034 |
| 14.12 | 98.146 |
| 14.13 | 96.943 |
| 14.14 | 100.587 |
| 14.15 | 99.3 |
| 14.16 | 97.273 |
| 14.17 | 95.937 |
| 14.18 | 100.423 |
| 14.19 | 102.831 |
| 14.2 | 103.384 |
| 14.21 | 105.059 |
| 14.22 | 106.168 |
| 14.23 | 111.193 |
| 14.24 | 112.465 |
| 14.25 | 111.523 |
| 14.26 | 107.626 |
| 14.27 | 111.664 |
| 14.28 | 107.859 |
| 14.29 | 106.416 |
| 14.3 | 105.863 |
| 14.31 | 107.505 |
| 14.32 | 106.727 |
| 14.33 | 104.101 |
| 14.34 | 104.943 |
| 14.35 | 103.078 |
| 14.36 | 105.402 |
| 14.37 | 104.822 |
| 14.38 | 106.857 |
| 14.39 | 108.93 |
| 14.4 | 107.198 |
| 14.41 | 106.258 |
| 14.42 | 103.705 |
| 14.43 | 100.406 |
| 14.44 | 97.99 |
| 14.45 | 91.847 |
| 14.46 | 93.191 |
| 14.47 | 94.42 |
| 14.48 | 96.114 |
| 14.49 | 98.441 |
| 14.5 | 93.754 |
| 14.51 | 93.002 |
| 14.52 | 95.379 |
| 14.53 | 88.658 |
| 14.54 | 89.409 |
| 14.55 | 86.721 |
| 14.56 | 90.091 |
| 14.57 | 87.658 |
| 14.58 | 91.699 |
| 14.59 | 89.923 |
| 14.6 | 88.675 |
| 14.61 | 89.419 |
| 14.62 | 89.469 |
| 14.63 | 88.563 |
| 14.64 | 87.724 |
| 14.65 | 89.453 |
| 14.66 | 89.55 |
| 14.67 | 90.089 |
| 14.68 | 89.514 |
| 14.69 | 88.996 |
| 14.7 | 91.101 |
| 14.71 | 91.119 |
| 14.72 | 89.028 |
| 14.73 | 88.893 |
| 14.74 | 87.371 |
| 14.75 | 92.97 |
| 14.76 | 87.774 |
| 14.77 | 87.261 |
| 14.78 | 84.568 |
| 14.79 | 82.401 |
| 14.8 | 80.806 |
| 14.81 | 79.436 |
| 14.82 | 82.64 |
| 14.83 | 80.986 |
| 14.84 | 82.337 |
| 14.85 | 83.465 |
| 14.86 | 86.274 |
| 14.87 | 84.875 |
| 14.88 | 83.971 |
| 14.89 | 85.345 |
| 14.9 | 90.058 |
| 14.91 | 89.273 |
| 14.92 | 92.383 |
| 14.93 | 98.794 |
| 14.94 | 93.432 |
| 14.95 | 95.078 |
| 14.96 | 92.009 |
| 14.97 | 96.452 |
| 14.98 | 94.506 |
| 14.99 | 93.321 |
| 15.0 | 90.863 |
| 15.01 | 89.366 |
| 15.02 | 92.743 |
| 15.03 | 89.244 |
| 15.04 | 93.506 |
| 15.05 | 96.013 |
| 15.06 | 94.497 |
| 15.07 | 88.995 |
| 15.08 | 88.825 |
| 15.09 | 86.848 |
| 15.1 | 83.519 |
| 15.11 | 81.26 |
| 15.12 | 79.817 |
| 15.13 | 80.315 |
| 15.14 | 80.476 |
| 15.15 | 80.918 |
| 15.16 | 81.214 |
| 15.17 | 81.536 |
| 15.18 | 81.002 |
| 15.19 | 82.515 |
| 15.2 | 79.83 |
| 15.21 | 79.943 |
| 15.22 | 82.394 |
| 15.23 | 83.985 |
| 15.24 | 85.221 |
| 15.25 | 85.156 |
| 15.26 | 91.627 |
| 15.27 | 90.59 |
| 15.28 | 94.033 |
| 15.29 | 96.98 |
| 15.3 | 95.937 |
| 15.31 | 99.614 |
| 15.32 | 99.793 |
| 15.33 | 97.638 |
| 15.34 | 100.091 |
| 15.35 | 98.78 |
| 15.36 | 97.255 |
| 15.37 | 102.321 |
| 15.38 | 101.166 |
| 15.39 | 102.139 |
| 15.4 | 103.113 |
| 15.41 | 104.796 |
| 15.42 | 103.938 |
| 15.43 | 101.078 |
| 15.44 | 100.827 |
| 15.45 | 101.528 |
| 15.46 | 103.297 |
| 15.47 | 102.874 |
| 15.48 | 102.189 |
| 15.49 | 100.807 |
| 15.5 | 99.568 |
| 15.51 | 101.42 |
| 15.52 | 94.791 |
| 15.53 | 101.724 |
| 15.54 | 104.113 |
| 15.55 | 101.052 |
| 15.56 | 101.171 |
| 15.57 | 95.718 |
| 15.58 | 94.605 |
| 15.59 | 93.503 |
| 15.6 | 98.676 |
| 15.61 | 96.744 |
| 15.62 | 93.38 |
| 15.63 | 89.559 |
| 15.64 | 93.219 |
| 15.65 | 95.876 |
| 15.66 | 98.791 |
| 15.67 | 94.861 |
| 15.68 | 88.098 |
| 15.69 | 92.265 |
| 15.7 | 93.39 |
| 15.71 | 94.966 |
| 15.72 | 93.793 |
| 15.73 | 96.583 |
| 15.74 | 96.927 |
| 15.75 | 97.526 |
| 15.76 | 96.787 |
| 15.77 | 97.903 |
| 15.78 | 95.141 |
| 15.79 | 96.485 |
| 15.8 | 94.94 |
| 15.81 | 99.929 |
| 15.82 | 97.436 |
| 15.83 | 99.877 |
| 15.84 | 101.742 |
| 15.85 | 99.716 |
| 15.86 | 101.636 |
| 15.87 | 103.779 |
| 15.88 | 109.6 |
| 15.89 | 111.23 |
| 15.9 | 114.489 |
| 15.91 | 113.522 |
| 15.92 | 117.236 |
| 15.93 | 118.476 |
| 15.94 | 121.659 |
| 15.95 | 122.415 |
| 15.96 | 124.118 |
| 15.97 | 120.702 |
| 15.98 | 117.201 |
| 15.99 | 121.099 |
| 16.0 | 117.003 |
| 16.01 | 111.795 |
| 16.02 | 113.495 |
| 16.03 | 116.987 |
| 16.04 | 116.649 |
| 16.05 | 119.396 |
| 16.06 | 118.726 |
| 16.07 | 121.728 |
| 16.08 | 124.529 |
| 16.09 | 129.597 |
| 16.1 | 123.094 |
| 16.11 | 125.638 |
| 16.12 | 132.018 |
| 16.13 | 134.381 |
| 16.14 | 128.138 |
| 16.15 | 130.606 |
| 16.16 | 139.883 |
| 16.17 | 140.362 |
| 16.18 | 143.898 |
| 16.19 | 139.506 |
| 16.2 | 137.443 |
| 16.21 | 138.284 |
| 16.22 | 136.583 |
| 16.23 | 133.815 |
| 16.24 | 130.325 |
| 16.25 | 136.817 |
| 16.26 | 134.428 |
| 16.27 | 134.699 |
| 16.28 | 131.673 |
| 16.29 | 132.784 |
| 16.3 | 122.016 |
| 16.31 | 125.498 |
| 16.32 | 125.24 |
| 16.33 | 130.582 |
| 16.34 | 138.018 |
| 16.35 | 135.354 |
| 16.36 | 131.278 |
| 16.37 | 122.66 |
| 16.38 | 118.892 |
| 16.39 | 116.886 |
| 16.4 | 117.113 |
| 16.41 | 120.706 |
| 16.42 | 119.911 |
| 16.43 | 117.76 |
| 16.44 | 114.728 |
| 16.45 | 119.127 |
| 16.46 | 115.49 |
| 16.47 | 118.051 |
| 16.48 | 114.525 |
| 16.49 | 113.582 |
| 16.5 | 111.656 |
| 16.51 | 107.316 |
| 16.52 | 106.173 |
| 16.53 | 109.319 |
| 16.54 | 104.368 |
| 16.55 | 106.569 |
| 16.56 | 100.397 |
| 16.57 | 101.356 |
| 16.58 | 97.388 |
| 16.59 | 95.816 |
| 16.6 | 93.295 |
| 16.61 | 89.214 |
| 16.62 | 86.978 |
| 16.63 | 83.967 |
| 16.64 | 80.24 |
| 16.65 | 81.86 |
| 16.66 | 80.498 |
| 16.67 | 82.928 |
| 16.68 | 83.465 |
| 16.69 | 80.391 |
| 16.7 | 79.413 |
| 16.71 | 82.071 |
| 16.72 | 85.33 |
| 16.73 | 85.471 |
| 16.74 | 88.616 |
| 16.75 | 91.06 |
| 16.76 | 90.392 |
| 16.77 | 89.439 |
| 16.78 | 85.526 |
| 16.79 | 83.649 |
| 16.8 | 82.892 |
| 16.81 | 81.435 |
| 16.82 | 84.05 |
| 16.83 | 77.375 |
| 16.84 | 74.551 |
| 16.85 | 71.626 |
| 16.86 | 72.316 |
| 16.87 | 72.571 |
| 16.88 | 77.244 |
| 16.89 | 75.755 |
| 16.9 | 72.741 |
| 16.91 | 73.575 |
| 16.92 | 74.676 |
| 16.93 | 72.972 |
| 16.94 | 75.095 |
| 16.95 | 74.512 |
| 16.96 | 74.127 |
| 16.97 | 71.371 |
| 16.98 | 69.803 |
| 16.99 | 68.172 |
| 17.0 | 68.106 |
| 17.01 | 69.136 |
| 17.02 | 69.487 |
| 17.03 | 68.389 |
| 17.04 | 68.797 |
| 17.05 | 63.744 |
| 17.06 | 64.856 |
| 17.07 | 65.713 |
| 17.08 | 66.545 |
| 17.09 | 68.095 |
| 17.1 | 66.755 |
| 17.11 | 71.441 |
| 17.12 | 69.655 |
| 17.13 | 72.883 |
| 17.14 | 70.733 |
| 17.15 | 75.539 |
| 17.16 | 79.176 |
| 17.17 | 80.465 |
| 17.18 | 80.867 |
| 17.19 | 81.517 |
| 17.2 | 80.578 |
| 17.21 | 76.326 |
| 17.22 | 78.196 |
| 17.23 | 75.561 |
| 17.24 | 75.615 |
| 17.25 | 76.528 |
| 17.26 | 73.927 |
| 17.27 | 72.197 |
| 17.28 | 70.007 |
| 17.29 | 70.653 |
| 17.3 | 69.613 |
| 17.31 | 65.314 |
| 17.32 | 64.724 |
| 17.33 | 67.649 |
| 17.34 | 69.009 |
| 17.35 | 66.587 |
| 17.36 | 63.51 |
| 17.37 | 65.272 |
| 17.38 | 67.644 |
| 17.39 | 66.246 |
| 17.4 | 67.408 |
| 17.41 | 68.65 |
| 17.42 | 69.49 |
| 17.43 | 71.316 |
| 17.44 | 68.057 |
| 17.45 | 66.363 |
| 17.46 | 67.145 |
| 17.47 | 68.026 |
| 17.48 | 70.473 |
| 17.49 | 69.951 |
| 17.5 | 70.402 |
| 17.51 | 71.526 |
| 17.52 | 72.672 |
| 17.53 | 72.743 |
| 17.54 | 74.598 |
| 17.55 | 71.83 |
| 17.56 | 73.953 |
| 17.57 | 73.504 |
| 17.58 | 72.204 |
| 17.59 | 73.902 |
| 17.6 | 74.858 |
| 17.61 | 75.165 |
| 17.62 | 76.919 |
| 17.63 | 76.733 |
| 17.64 | 75.543 |
| 17.65 | 78.782 |
| 17.66 | 77.232 |
| 17.67 | 73.461 |
| 17.68 | 74.532 |
| 17.69 | 76.246 |
| 17.7 | 77.903 |
| 17.71 | 81.7 |
| 17.72 | 80.851 |
| 17.73 | 77.56 |
| 17.74 | 78.338 |
| 17.75 | 78.032 |
| 17.76 | 78.657 |
| 17.77 | 82.056 |
| 17.78 | 84.917 |
| 17.79 | 80.171 |
| 17.8 | 87.291 |
| 17.81 | 92.673 |
| 17.82 | 90.44 |
| 17.83 | 87.265 |
| 17.84 | 88.3 |
| 17.85 | 90.533 |
| 17.86 | 90.191 |
| 17.87 | 95.63 |
| 17.88 | 101.317 |
| 17.89 | 100.357 |
| 17.9 | 102.942 |
| 17.91 | 104.407 |
| 17.92 | 99.508 |
| 17.93 | 99.696 |
| 17.94 | 102.731 |
| 17.95 | 107.697 |
| 17.96 | 107.921 |
| 17.97 | 115.349 |
| 17.98 | 111.242 |
| 17.99 | 114.409 |
| 18.0 | 107.239 |
| 18.01 | 107.821 |
| 18.02 | 104.752 |
| 18.03 | 106.05 |
| 18.04 | 101.526 |
| 18.05 | 105.488 |
| 18.06 | 103.731 |
| 18.07 | 100.309 |
| 18.08 | 98.096 |
| 18.09 | 99.492 |
| 18.1 | 96.605 |
| 18.11 | 100.59 |
| 18.12 | 100.146 |
| 18.13 | 97.492 |
| 18.14 | 93.036 |
| 18.15 | 95.464 |
| 18.16 | 95.284 |
| 18.17 | 98.582 |
| 18.18 | 102.38 |
| 18.19 | 104.057 |
| 18.2 | 110.788 |
| 18.21 | 114.676 |
| 18.22 | 120.217 |
| 18.23 | 115.754 |
| 18.24 | 114.132 |
| 18.25 | 107.032 |
| 18.26 | 104.05 |
| 18.27 | 103.581 |
| 18.28 | 101.036 |
| 18.29 | 107.539 |
| 18.3 | 105.677 |
| 18.31 | 107.781 |
| 18.32 | 113.879 |
| 18.33 | 116.837 |
| 18.34 | 115.969 |
| 18.35 | 114.815 |
| 18.36 | 117.583 |
| 18.37 | 120.715 |
| 18.38 | 122.303 |
| 18.39 | 116.815 |
| 18.4 | 116.83 |
| 18.41 | 115.682 |
| 18.42 | 117.741 |
| 18.43 | 121.716 |
| 18.44 | 122.312 |
| 18.45 | 122.505 |
| 18.46 | 120.501 |
| 18.47 | 126.055 |
| 18.48 | 119.646 |
| 18.49 | 116.132 |
| 18.5 | 114.302 |
| 18.51 | 103.987 |
| 18.52 | 100.857 |
| 18.53 | 104.015 |
| 18.54 | 106.257 |
| 18.55 | 106.54 |
| 18.56 | 106.51 |
| 18.57 | 107.023 |
| 18.58 | 110.185 |
| 18.59 | 105.538 |
| 18.6 | 114.744 |
| 18.61 | 110.253 |
| 18.62 | 111.454 |
| 18.63 | 110.879 |
| 18.64 | 102.717 |
| 18.65 | 104.896 |
| 18.66 | 106.717 |
| 18.67 | 103.041 |
| 18.68 | 99.415 |
| 18.69 | 103.054 |
| 18.7 | 103.794 |
| 18.71 | 109.036 |
| 18.72 | 109.764 |
| 18.73 | 112.044 |
| 18.74 | 106.06 |
| 18.75 | 111.176 |
| 18.76 | 115.02 |
| 18.77 | 110.208 |
| 18.78 | 112.762 |
| 18.79 | 114.104 |
| 18.8 | 114.604 |
| 18.81 | 113.208 |
| 18.82 | 119.706 |
| 18.83 | 123.786 |
| 18.84 | 125.3 |
| 18.85 | 127.072 |
| 18.86 | 139.098 |
| 18.87 | 148.103 |
| 18.88 | 156.307 |
| 18.89 | 154.294 |
| 18.9 | 153.138 |
| 18.91 | 157.785 |
| 18.92 | 152.27 |
| 18.93 | 146.516 |
| 18.94 | 140.923 |
| 18.95 | 141.597 |
| 18.96 | 139.446 |
| 18.97 | 142.336 |
| 18.98 | 138.769 |
| 18.99 | 141.2 |
| 19.0 | 138.899 |
| 19.01 | 133.121 |
| 19.02 | 127.564 |
| 19.03 | 125.954 |
| 19.04 | 123.728 |
| 19.05 | 124.031 |
| 19.06 | 124.093 |
| 19.07 | 127.544 |
| 19.08 | 133.351 |
| 19.09 | 122.489 |
| 19.1 | 117.579 |
| 19.11 | 116.323 |
| 19.12 | 117.821 |
| 19.13 | 117.128 |
| 19.14 | 122.3 |
| 19.15 | 125.015 |
| 19.16 | 122.123 |
| 19.17 | 123.456 |
| 19.18 | 120.468 |
| 19.19 | 128.046 |
| 19.2 | 129.729 |
| 19.21 | 132.094 |
| 19.22 | 132.801 |
| 19.23 | 128.863 |
| 19.24 | 128.944 |
| 19.25 | 126.729 |
| 19.26 | 116.386 |
| 19.27 | 116.215 |
| 19.28 | 109.189 |
| 19.29 | 108.491 |
| 19.3 | 109.069 |
| 19.31 | 110.637 |
| 19.32 | 108.818 |
| 19.33 | 111.701 |
| 19.34 | 110.986 |
| 19.35 | 117.177 |
| 19.36 | 120.637 |
| 19.37 | 121.041 |
| 19.38 | 120.699 |
| 19.39 | 117.53 |
| 19.4 | 113.184 |
| 19.41 | 118.251 |
| 19.42 | 116.408 |
| 19.43 | 112.271 |
| 19.44 | 112.66 |
| 19.45 | 113.105 |
| 19.46 | 111.384 |
| 19.47 | 105.972 |
| 19.48 | 108.363 |
| 19.49 | 106.441 |
| 19.5 | 103.959 |
| 19.51 | 107.3 |
| 19.52 | 107.544 |
| 19.53 | 105.539 |
| 19.54 | 107.473 |
| 19.55 | 111.174 |
| 19.56 | 111.684 |
| 19.57 | 103.393 |
| 19.58 | 102.069 |
| 19.59 | 100.6 |
| 19.6 | 102.664 |
| 19.61 | 98.087 |
| 19.62 | 96.949 |
| 19.63 | 99.465 |
| 19.64 | 98.803 |
| 19.65 | 104.797 |
| 19.66 | 109.289 |
| 19.67 | 110.881 |
| 19.68 | 108.943 |
| 19.69 | 108.933 |
| 19.7 | 115.825 |
| 19.71 | 113.91 |
| 19.72 | 115.458 |
| 19.73 | 119.41 |
| 19.74 | 116.979 |
| 19.75 | 114.134 |
| 19.76 | 113.278 |
| 19.77 | 108.304 |
| 19.78 | 108.924 |
| 19.79 | 105.291 |
| 19.8 | 105.717 |
| 19.81 | 108.25 |
| 19.82 | 109.09 |
| 19.83 | 116.445 |
| 19.84 | 122.353 |
| 19.85 | 121.083 |
| 19.86 | 122.77 |
| 19.87 | 126.035 |
| 19.88 | 128.483 |
| 19.89 | 132.994 |
| 19.9 | 134.561 |
| 19.91 | 131.385 |
| 19.92 | 128.72 |
| 19.93 | 131.113 |
| 19.94 | 131.422 |
| 19.95 | 132.35 |
| 19.96 | 142.228 |
| 19.97 | 140.951 |
| 19.98 | 141.754 |
| 19.99 | 139.426 |
| 20.0 | 133.569 |